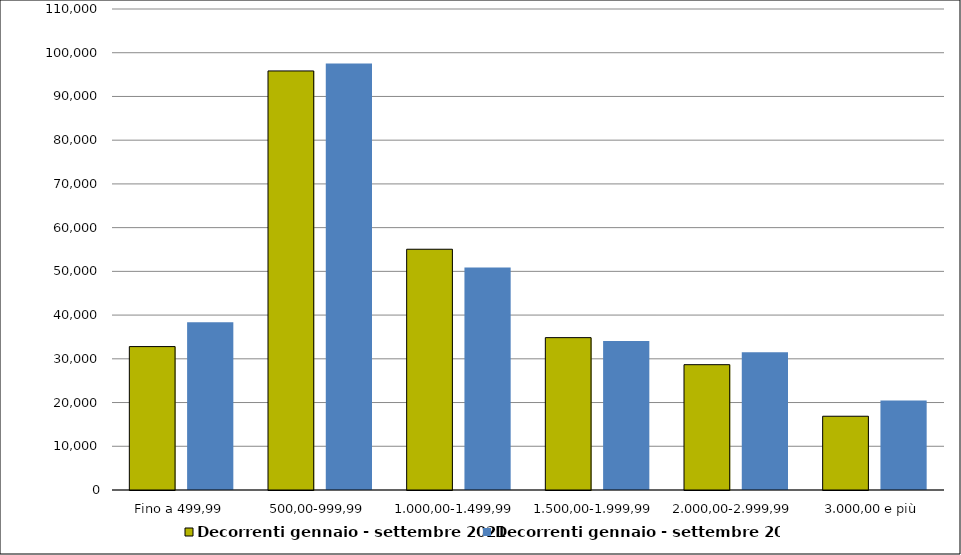
| Category | Decorrenti gennaio - settembre 2021 | Decorrenti gennaio - settembre 2020 |
|---|---|---|
|  Fino a 499,99  | 32796 | 38363 |
|  500,00-999,99  | 95833 | 97563 |
|  1.000,00-1.499,99  | 55060 | 50902 |
|  1.500,00-1.999,99  | 34844 | 34081 |
|  2.000,00-2.999,99  | 28660 | 31509 |
|  3.000,00 e più  | 16869 | 20450 |